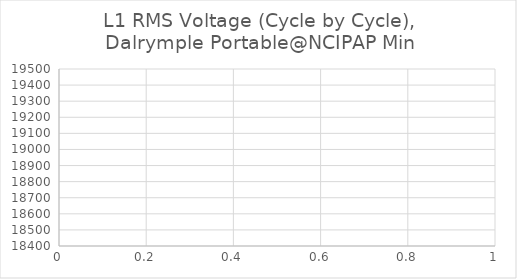
| Category | L1 RMS Voltage (Cycle by Cycle), Dalrymple Portable@NCIPAP Min |
|---|---|
| 0 | 19288.42 |
| 1 | 19290.53 |
| 2 | 19290.47 |
| 3 | 19290.45 |
| 4 | 19290.43 |
| 5 | 19285.95 |
| 6 | 19287.96 |
| 7 | 19289.97 |
| 8 | 19281.6 |
| 9 | 19283.54 |
| 10 | 19285.48 |
| 11 | 19285.42 |
| 12 | 19287.42 |
| 13 | 19289.42 |
| 14 | 19289.46 |
| 15 | 19291.43 |
| 16 | 19293.41 |
| 17 | 19293.39 |
| 18 | 19291.42 |
| 19 | 19289.45 |
| 20 | 19289.43 |
| 21 | 19289.42 |
| 22 | 19289.42 |
| 23 | 19291.41 |
| 24 | 19293.39 |
| 25 | 19293.42 |
| 26 | 19293.44 |
| 27 | 19293.45 |
| 28 | 19289.01 |
| 29 | 19289 |
| 30 | 19288.98 |
| 31 | 19288.95 |
| 32 | 19290.93 |
| 33 | 19292.91 |
| 34 | 19296.83 |
| 35 | 19294.88 |
| 36 | 19292.94 |
| 37 | 19288.95 |
| 38 | 19291.16 |
| 39 | 19293.38 |
| 40 | 19289.4 |
| 41 | 19287.43 |
| 42 | 19285.46 |
| 43 | 19289.94 |
| 44 | 19289.94 |
| 45 | 19289.94 |
| 46 | 19292.19 |
| 47 | 19294.44 |
| 48 | 19294.42 |
| 49 | 19292.43 |
| 50 | 19290.44 |
| 51 | 19290.45 |
| 52 | 19292.41 |
| 53 | 19294.38 |
| 54 | 19294.36 |
| 55 | 19292.14 |
| 56 | 19289.93 |
| 57 | 19289.98 |
| 58 | 19290 |
| 59 | 19290.02 |
| 60 | 19289.95 |
| 61 | 19291.88 |
| 62 | 19293.82 |
| 63 | 19293.85 |
| 64 | 19291.62 |
| 65 | 19289.39 |
| 66 | 19289.37 |
| 67 | 19291.38 |
| 68 | 19293.39 |
| 69 | 19285.03 |
| 70 | 19285.02 |
| 71 | 19285.01 |
| 72 | 19286.98 |
| 73 | 19288.95 |
| 74 | 19288.91 |
| 75 | 19290.88 |
| 76 | 19292.85 |
| 77 | 19292.88 |
| 78 | 19292.89 |
| 79 | 19292.89 |
| 80 | 19292.95 |
| 81 | 19290.98 |
| 82 | 19289.01 |
| 83 | 19292.91 |
| 84 | 19292.9 |
| 85 | 19292.89 |
| 86 | 19292.87 |
| 87 | 19290.67 |
| 88 | 19288.46 |
| 89 | 19288.47 |
| 90 | 19290.47 |
| 91 | 19292.47 |
| 92 | 19284.06 |
| 93 | 19288.27 |
| 94 | 19292.48 |
| 95 | 19284.08 |
| 96 | 19284.07 |
| 97 | 19284.05 |
| 98 | 19286.04 |
| 99 | 19288.03 |
| 100 | 19284.02 |
| 101 | 19284.04 |
| 102 | 19284.07 |
| 103 | 19292.46 |
| 104 | 19288.27 |
| 105 | 19284.07 |
| 106 | 19292.45 |
| 107 | 19288.25 |
| 108 | 19284.05 |
| 109 | 19284.05 |
| 110 | 19284.05 |
| 111 | 19288.01 |
| 112 | 19291.99 |
| 113 | 19289.82 |
| 114 | 19287.66 |
| 115 | 19291.7 |
| 116 | 19291.49 |
| 117 | 19291.27 |
| 118 | 19286.88 |
| 119 | 19288.87 |
| 120 | 19290.85 |
| 121 | 19290.48 |
| 122 | 19292.54 |
| 123 | 19294.6 |
| 124 | 19294.46 |
| 125 | 19294.32 |
| 126 | 19289.95 |
| 127 | 19287.76 |
| 128 | 19285.57 |
| 129 | 19289.62 |
| 130 | 19291.69 |
| 131 | 19293.75 |
| 132 | 19297.81 |
| 133 | 19293.63 |
| 134 | 19289.44 |
| 135 | 19285.19 |
| 136 | 19287.22 |
| 137 | 19289.24 |
| 138 | 19293.24 |
| 139 | 19291.07 |
| 140 | 19288.91 |
| 141 | 19284.7 |
| 142 | 19286.79 |
| 143 | 19288.88 |
| 144 | 19293 |
| 145 | 19292.97 |
| 146 | 19292.95 |
| 147 | 19288.62 |
| 148 | 19288.6 |
| 149 | 19288.59 |
| 150 | 19290.67 |
| 151 | 19292.76 |
| 152 | 19296.87 |
| 153 | 19292.7 |
| 154 | 19288.54 |
| 155 | 19292.61 |
| 156 | 19292.6 |
| 157 | 19292.6 |
| 158 | 19292.59 |
| 159 | 19290.53 |
| 160 | 19288.46 |
| 161 | 19288.52 |
| 162 | 19288.52 |
| 163 | 19288.53 |
| 164 | 19288.53 |
| 165 | 19288.51 |
| 166 | 19288.5 |
| 167 | 19288.5 |
| 168 | 19290.54 |
| 169 | 19292.58 |
| 170 | 19288.4 |
| 171 | 19290.49 |
| 172 | 19292.58 |
| 173 | 19288.43 |
| 174 | 19288.39 |
| 175 | 19288.34 |
| 176 | 19286.2 |
| 177 | 19284.06 |
| 178 | 19288.2 |
| 179 | 19286.11 |
| 180 | 19284.03 |
| 181 | 19284.04 |
| 182 | 19288.19 |
| 183 | 19292.34 |
| 184 | 19284.05 |
| 185 | 19286.11 |
| 186 | 19288.17 |
| 187 | 19283.97 |
| 188 | 19286.04 |
| 189 | 19288.11 |
| 190 | 19288.16 |
| 191 | 19288.16 |
| 192 | 19288.17 |
| 193 | 19288.19 |
| 194 | 19288.21 |
| 195 | 19288.24 |
| 196 | 19288.24 |
| 197 | 19288.18 |
| 198 | 19288.11 |
| 199 | 19288.08 |
| 200 | 19290.2 |
| 201 | 19292.32 |
| 202 | 19290.27 |
| 203 | 19288.22 |
| 204 | 19292.32 |
| 205 | 19290.24 |
| 206 | 19288.16 |
| 207 | 19288.21 |
| 208 | 19288.18 |
| 209 | 19288.15 |
| 210 | 19288.09 |
| 211 | 19288.1 |
| 212 | 19288.12 |
| 213 | 19288.21 |
| 214 | 19288.21 |
| 215 | 19288.22 |
| 216 | 19288.21 |
| 217 | 19288.21 |
| 218 | 19284.06 |
| 219 | 19288.14 |
| 220 | 19290.18 |
| 221 | 19292.23 |
| 222 | 19296.48 |
| 223 | 19292.36 |
| 224 | 19288.24 |
| 225 | 19288.22 |
| 226 | 19290.31 |
| 227 | 19292.39 |
| 228 | 19290.31 |
| 229 | 19288.23 |
| 230 | 19288.18 |
| 231 | 19288.2 |
| 232 | 19288.22 |
| 233 | 19288.28 |
| 234 | 19290.38 |
| 235 | 19292.48 |
| 236 | 19288.37 |
| 237 | 19288.37 |
| 238 | 19288.38 |
| 239 | 19292.59 |
| 240 | 19290.5 |
| 241 | 19288.41 |
| 242 | 19292.55 |
| 243 | 19292.58 |
| 244 | 19292.61 |
| 245 | 19292.56 |
| 246 | 19286.29 |
| 247 | 19280.01 |
| 248 | 19288.32 |
| 249 | 19288.37 |
| 250 | 19288.41 |
| 251 | 19288.45 |
| 252 | 19288.4 |
| 253 | 19288.36 |
| 254 | 19288.35 |
| 255 | 19288.35 |
| 256 | 19292.54 |
| 257 | 19288.39 |
| 258 | 19284.23 |
| 259 | 19288.49 |
| 260 | 19288.48 |
| 261 | 19288.47 |
| 262 | 19288.48 |
| 263 | 19288.49 |
| 264 | 19288.5 |
| 265 | 19284.29 |
| 266 | 19284.26 |
| 267 | 19284.22 |
| 268 | 19292.48 |
| 269 | 19290.43 |
| 270 | 19288.38 |
| 271 | 19284.19 |
| 272 | 19286.23 |
| 273 | 19288.27 |
| 274 | 19284.09 |
| 275 | 19288.27 |
| 276 | 19292.46 |
| 277 | 19288.33 |
| 278 | 19288.33 |
| 279 | 19288.13 |
| 280 | 19288.13 |
| 281 | 19288.12 |
| 282 | 19292.38 |
| 283 | 19288.23 |
| 284 | 19284.09 |
| 285 | 19288.28 |
| 286 | 19286.25 |
| 287 | 19284.22 |
| 288 | 19284.26 |
| 289 | 19286.33 |
| 290 | 19288.4 |
| 291 | 19292.5 |
| 292 | 19288.38 |
| 293 | 19284.25 |
| 294 | 19288.42 |
| 295 | 19288.48 |
| 296 | 19288.54 |
| 297 | 19292.76 |
| 298 | 19292.74 |
| 299 | 19292.72 |
| 300 | 19288.54 |
| 301 | 19288.56 |
| 302 | 19288.57 |
| 303 | 19288.59 |
| 304 | 19288.61 |
| 305 | 19292.82 |
| 306 | 19288.68 |
| 307 | 19284.54 |
| 308 | 19284.61 |
| 309 | 19288.83 |
| 310 | 19288.83 |
| 311 | 19292.95 |
| 312 | 19292.92 |
| 313 | 19292.9 |
| 314 | 19288.74 |
| 315 | 19288.76 |
| 316 | 19288.78 |
| 317 | 19288.78 |
| 318 | 19286.69 |
| 319 | 19284.59 |
| 320 | 19292.83 |
| 321 | 19290.71 |
| 322 | 19288.59 |
| 323 | 19288.57 |
| 324 | 19288.57 |
| 325 | 19284.37 |
| 326 | 19292.69 |
| 327 | 19292.69 |
| 328 | 19292.7 |
| 329 | 19288.54 |
| 330 | 19284.38 |
| 331 | 19288.51 |
| 332 | 19288.56 |
| 333 | 19288.62 |
| 334 | 19292.89 |
| 335 | 19290.85 |
| 336 | 19288.81 |
| 337 | 19292.97 |
| 338 | 19290.95 |
| 339 | 19288.94 |
| 340 | 19284.62 |
| 341 | 19286.77 |
| 342 | 19288.92 |
| 343 | 19288.95 |
| 344 | 19288.96 |
| 345 | 19288.97 |
| 346 | 19284.72 |
| 347 | 19284.7 |
| 348 | 19284.68 |
| 349 | 19292.98 |
| 350 | 19292.94 |
| 351 | 19292.9 |
| 352 | 19292.95 |
| 353 | 19290.87 |
| 354 | 19288.79 |
| 355 | 19288.8 |
| 356 | 19288.82 |
| 357 | 19288.8 |
| 358 | 19288.77 |
| 359 | 19288.73 |
| 360 | 19288.76 |
| 361 | 19288.73 |
| 362 | 19288.71 |
| 363 | 19292.95 |
| 364 | 19290.86 |
| 365 | 19288.77 |
| 366 | 19288.76 |
| 367 | 19290.81 |
| 368 | 19292.86 |
| 369 | 19288.58 |
| 370 | 19290.61 |
| 371 | 19292.65 |
| 372 | 19288.45 |
| 373 | 19288.38 |
| 374 | 19288.31 |
| 375 | 19288.3 |
| 376 | 19288.27 |
| 377 | 19288.24 |
| 378 | 19284.11 |
| 379 | 19286.16 |
| 380 | 19288.22 |
| 381 | 19286.12 |
| 382 | 19284.01 |
| 383 | 19288.14 |
| 384 | 19286.06 |
| 385 | 19283.97 |
| 386 | 19288.12 |
| 387 | 19288.11 |
| 388 | 19288.1 |
| 389 | 19292.29 |
| 390 | 19290.23 |
| 391 | 19288.17 |
| 392 | 19288.18 |
| 393 | 19286.11 |
| 394 | 19284.04 |
| 395 | 19288.14 |
| 396 | 19290.2 |
| 397 | 19292.26 |
| 398 | 19292.34 |
| 399 | 19292.33 |
| 400 | 19292.32 |
| 401 | 19284.05 |
| 402 | 19286.14 |
| 403 | 19288.24 |
| 404 | 19284.04 |
| 405 | 19284.01 |
| 406 | 19283.97 |
| 407 | 19283.96 |
| 408 | 19283.95 |
| 409 | 19292.28 |
| 410 | 19292.3 |
| 411 | 19292.33 |
| 412 | 19288.2 |
| 413 | 19290.29 |
| 414 | 19292.38 |
| 415 | 19288.23 |
| 416 | 19288.19 |
| 417 | 19288.14 |
| 418 | 19288.08 |
| 419 | 19290.16 |
| 420 | 19292.24 |
| 421 | 19288.15 |
| 422 | 19288.15 |
| 423 | 19288.15 |
| 424 | 19283.99 |
| 425 | 19286.09 |
| 426 | 19288.19 |
| 427 | 19292.44 |
| 428 | 19292.45 |
| 429 | 19292.46 |
| 430 | 19284.17 |
| 431 | 19286.22 |
| 432 | 19288.27 |
| 433 | 19284.1 |
| 434 | 19279.93 |
| 435 | 19284.11 |
| 436 | 19286.21 |
| 437 | 19288.32 |
| 438 | 19288.35 |
| 439 | 19290.48 |
| 440 | 19292.61 |
| 441 | 19292.63 |
| 442 | 19290.6 |
| 443 | 19288.57 |
| 444 | 19292.68 |
| 445 | 19290.61 |
| 446 | 19288.54 |
| 447 | 19292.78 |
| 448 | 19292.8 |
| 449 | 19292.82 |
| 450 | 19288.81 |
| 451 | 19288.81 |
| 452 | 19288.81 |
| 453 | 19292.95 |
| 454 | 19290.92 |
| 455 | 19288.89 |
| 456 | 19288.86 |
| 457 | 19291.02 |
| 458 | 19293.18 |
| 459 | 19289.06 |
| 460 | 19284.95 |
| 461 | 19289.23 |
| 462 | 19291.32 |
| 463 | 19293.41 |
| 464 | 19285.09 |
| 465 | 19287.18 |
| 466 | 19289.27 |
| 467 | 19293.57 |
| 468 | 19289.47 |
| 469 | 19285.38 |
| 470 | 19289.66 |
| 471 | 19289.69 |
| 472 | 19289.72 |
| 473 | 19285.61 |
| 474 | 19287.68 |
| 475 | 19289.76 |
| 476 | 19294.06 |
| 477 | 19290 |
| 478 | 19285.94 |
| 479 | 19290.19 |
| 480 | 19292.36 |
| 481 | 19294.53 |
| 482 | 19286.18 |
| 483 | 19286.15 |
| 484 | 19286.12 |
| 485 | 19286.44 |
| 486 | 19288.61 |
| 487 | 19290.78 |
| 488 | 19290.8 |
| 489 | 19290.81 |
| 490 | 19286.93 |
| 491 | 19286.91 |
| 492 | 19286.89 |
| 493 | 19291.12 |
| 494 | 19291.1 |
| 495 | 19291.08 |
| 496 | 19287.21 |
| 497 | 19289.39 |
| 498 | 19291.58 |
| 499 | 19295.93 |
| 500 | 19291.8 |
| 501 | 19287.67 |
| 502 | 19288.02 |
| 503 | 19290.15 |
| 504 | 19292.29 |
| 505 | 19288.43 |
| 506 | 19290.62 |
| 507 | 19292.81 |
| 508 | 19284.57 |
| 509 | 19286.74 |
| 510 | 19288.92 |
| 511 | 19288.97 |
| 512 | 19286.78 |
| 513 | 19284.58 |
| 514 | 19286.73 |
| 515 | 19288.89 |
| 516 | 19288.88 |
| 517 | 19288.9 |
| 518 | 19288.92 |
| 519 | 19293.27 |
| 520 | 19291.34 |
| 521 | 19289.41 |
| 522 | 19285.53 |
| 523 | 19287.74 |
| 524 | 19289.95 |
| 525 | 19286.16 |
| 526 | 19290.51 |
| 527 | 19294.85 |
| 528 | 19291.02 |
| 529 | 19289.08 |
| 530 | 19287.14 |
| 531 | 19291.5 |
| 532 | 19289.59 |
| 533 | 19287.68 |
| 534 | 19292.14 |
| 535 | 19292.19 |
| 536 | 19292.23 |
| 537 | 19292.23 |
| 538 | 19288.12 |
| 539 | 19284.01 |
| 540 | 19288.09 |
| 541 | 19292.17 |
| 542 | 19287.75 |
| 543 | 19289.64 |
| 544 | 19291.52 |
| 545 | 19295.9 |
| 546 | 19291.82 |
| 547 | 19287.74 |
| 548 | 19287.79 |
| 549 | 19285.58 |
| 550 | 19283.37 |
| 551 | 19287.7 |
| 552 | 19287.7 |
| 553 | 19287.7 |
| 554 | 19287.77 |
| 555 | 19287.79 |
| 556 | 19287.81 |
| 557 | 19292.18 |
| 558 | 19288.06 |
| 559 | 19283.94 |
| 560 | 19288.32 |
| 561 | 19288.34 |
| 562 | 19288.35 |
| 563 | 19288.39 |
| 564 | 19290.61 |
| 565 | 19292.83 |
| 566 | 19288.73 |
| 567 | 19284.64 |
| 568 | 19284.62 |
| 569 | 19286.79 |
| 570 | 19288.96 |
| 571 | 19285.19 |
| 572 | 19287.39 |
| 573 | 19289.6 |
| 574 | 19294.07 |
| 575 | 19289.99 |
| 576 | 19285.92 |
| 577 | 19290.38 |
| 578 | 19290.35 |
| 579 | 19290.32 |
| 580 | 19286.6 |
| 581 | 19286.6 |
| 582 | 19286.59 |
| 583 | 19286.58 |
| 584 | 19286.59 |
| 585 | 19286.6 |
| 586 | 19286.63 |
| 587 | 19286.62 |
| 588 | 19286.61 |
| 589 | 19286.56 |
| 590 | 19286.57 |
| 591 | 19286.57 |
| 592 | 19286.58 |
| 593 | 19286.59 |
| 594 | 19286.51 |
| 595 | 19286.5 |
| 596 | 19286.5 |
| 597 | 19290.31 |
| 598 | 19288.12 |
| 599 | 19285.92 |
| 600 | 19285.98 |
| 601 | 19287.83 |
| 602 | 19289.67 |
| 603 | 19289.58 |
| 604 | 19287.38 |
| 605 | 19285.17 |
| 606 | 19285.17 |
| 607 | 19287.06 |
| 608 | 19288.95 |
| 609 | 19284.57 |
| 610 | 19288.68 |
| 611 | 19292.8 |
| 612 | 19288.44 |
| 613 | 19286.23 |
| 614 | 19284.02 |
| 615 | 19283.9 |
| 616 | 19285.78 |
| 617 | 19287.67 |
| 618 | 19287.68 |
| 619 | 19287.7 |
| 620 | 19283.36 |
| 621 | 19287.47 |
| 622 | 19291.58 |
| 623 | 19282.84 |
| 624 | 19284.74 |
| 625 | 19286.64 |
| 626 | 19290.43 |
| 627 | 19288.2 |
| 628 | 19285.97 |
| 629 | 19286.01 |
| 630 | 19286.01 |
| 631 | 19289.9 |
| 632 | 19289.89 |
| 633 | 19287.74 |
| 634 | 19285.6 |
| 635 | 19289.99 |
| 636 | 19289.96 |
| 637 | 19289.94 |
| 638 | 19286.04 |
| 639 | 19288.2 |
| 640 | 19290.36 |
| 641 | 19290.4 |
| 642 | 19290.39 |
| 643 | 19290.38 |
| 644 | 19290.4 |
| 645 | 19290.42 |
| 646 | 19290.46 |
| 647 | 19288.32 |
| 648 | 19286.18 |
| 649 | 19290.52 |
| 650 | 19290.52 |
| 651 | 19290.52 |
| 652 | 19286.54 |
| 653 | 19288.71 |
| 654 | 19290.89 |
| 655 | 19287.16 |
| 656 | 19289.38 |
| 657 | 19291.6 |
| 658 | 19292.2 |
| 659 | 19290.29 |
| 660 | 19288.39 |
| 661 | 19288.97 |
| 662 | 19289.27 |
| 663 | 19289.57 |
| 664 | 19294.74 |
| 665 | 19295.13 |
| 666 | 19295.5 |
| 667 | 19288.08 |
| 668 | 19290.69 |
| 669 | 19293.31 |
| 670 | 18899.69 |
| 671 | 18506.07 |
| 672 | 18644.22 |
| 673 | 18727 |
| 674 | 18809.78 |
| 675 | 18815.1 |
| 676 | 18871.26 |
| 677 | 18927.42 |
| 678 | 18982.47 |
| 679 | 19000.48 |
| 680 | 19018.5 |
| 681 | 19053.81 |
| 682 | 19074.37 |
| 683 | 19094.92 |
| 684 | 19127.95 |
| 685 | 19137.16 |
| 686 | 19146.37 |
| 687 | 19174.34 |
| 688 | 19181.1 |
| 689 | 19187.85 |
| 690 | 19209.36 |
| 691 | 19209.36 |
| 692 | 19229.5 |
| 693 | 19248.8 |
| 694 | 19254.33 |
| 695 | 19259.87 |
| 696 | 19264.03 |
| 697 | 19268.19 |
| 698 | 19275.1 |
| 699 | 19277.83 |
| 700 | 19280.56 |
| 701 | 19287.06 |
| 702 | 19288.43 |
| 703 | 19289.79 |
| 704 | 19291.53 |
| 705 | 19289.21 |
| 706 | 19286.9 |
| 707 | 19292.7 |
| 708 | 19292.74 |
| 709 | 19292.78 |
| 710 | 19286.85 |
| 711 | 19283.93 |
| 712 | 19281 |
| 713 | 19283.29 |
| 714 | 19282.16 |
| 715 | 19281.04 |
| 716 | 19283.53 |
| 717 | 19280.74 |
| 718 | 19277.95 |
| 719 | 19273.4 |
| 720 | 19269.3 |
| 721 | 19265.2 |
| 722 | 19266.21 |
| 723 | 19267.27 |
| 724 | 19268.32 |
| 725 | 19267.7 |
| 726 | 19267.07 |
| 727 | 19262.54 |
| 728 | 19262.68 |
| 729 | 19262.82 |
| 730 | 19268.17 |
| 731 | 19268.68 |
| 732 | 19269.19 |
| 733 | 19268.94 |
| 734 | 19272.04 |
| 735 | 19275.14 |
| 736 | 19281.47 |
| 737 | 19281.49 |
| 738 | 19281.51 |
| 739 | 19284.69 |
| 740 | 19283.14 |
| 741 | 19281.59 |
| 742 | 19278.57 |
| 743 | 19277.84 |
| 744 | 19277.11 |
| 745 | 19280.44 |
| 746 | 19278.8 |
| 747 | 19277.15 |
| 748 | 19275.32 |
| 749 | 19280.83 |
| 750 | 19286.33 |
| 751 | 19283.92 |
| 752 | 19281.51 |
| 753 | 19284.77 |
| 754 | 19284.01 |
| 755 | 19283.26 |
| 756 | 19289.73 |
| 757 | 19288.14 |
| 758 | 19286.55 |
| 759 | 19294.44 |
| 760 | 19296.04 |
| 761 | 19297.65 |
| 762 | 19295.95 |
| 763 | 19295.13 |
| 764 | 19294.32 |
| 765 | 19297.48 |
| 766 | 19295.1 |
| 767 | 19292.72 |
| 768 | 19292.7 |
| 769 | 19288.65 |
| 770 | 19284.61 |
| 771 | 19289.42 |
| 772 | 19289.46 |
| 773 | 19289.49 |
| 774 | 19289.53 |
| 775 | 19287.13 |
| 776 | 19284.73 |
| 777 | 19286.32 |
| 778 | 19287.91 |
| 779 | 19291.01 |
| 780 | 19290.2 |
| 781 | 19289.39 |
| 782 | 19300.61 |
| 783 | 19299.87 |
| 784 | 19299.12 |
| 785 | 19297.64 |
| 786 | 19297.66 |
| 787 | 19297.67 |
| 788 | 19289.56 |
| 789 | 19290.32 |
| 790 | 19291.08 |
| 791 | 19295.85 |
| 792 | 19294.23 |
| 793 | 19292.61 |
| 794 | 19297.46 |
| 795 | 19297.5 |
| 796 | 19297.55 |
| 797 | 19300.77 |
| 798 | 19300.77 |
| 799 | 19291.12 |
| 800 | 19298.96 |
| 801 | 19296.62 |
| 802 | 19294.27 |
| 803 | 19298.34 |
| 804 | 19302.4 |
| 805 | 19297.75 |
| 806 | 19298.47 |
| 807 | 19299.19 |
| 808 | 19300.61 |
| 809 | 19299.79 |
| 810 | 19298.96 |
| 811 | 19297.48 |
| 812 | 19296.73 |
| 813 | 19295.99 |
| 814 | 19302.43 |
| 815 | 19299.34 |
| 816 | 19296.24 |
| 817 | 19297.94 |
| 818 | 19293.93 |
| 819 | 19289.92 |
| 820 | 19289.92 |
| 821 | 19293.88 |
| 822 | 19297.85 |
| 823 | 19297.87 |
| 824 | 19296.38 |
| 825 | 19294.89 |
| 826 | 19299.79 |
| 827 | 19298.21 |
| 828 | 19296.64 |
| 829 | 19300.16 |
| 830 | 19300.16 |
| 831 | 19299.03 |
| 832 | 19296.93 |
| 833 | 19294.83 |
| 834 | 19298.73 |
| 835 | 19300.73 |
| 836 | 19302.72 |
| 837 | 19301.83 |
| 838 | 19298.91 |
| 839 | 19295.99 |
| 840 | 19298.01 |
| 841 | 19296.57 |
| 842 | 19295.13 |
| 843 | 19300.1 |
| 844 | 19300.15 |
| 845 | 19300.2 |
| 846 | 19303.04 |
| 847 | 19300.5 |
| 848 | 19297.96 |
| 849 | 19300.81 |
| 850 | 19302.27 |
| 851 | 19303.72 |
| 852 | 19303.82 |
| 853 | 19303.88 |
| 854 | 19303.92 |
| 855 | 19303.93 |
| 856 | 19303.93 |
| 857 | 19308.84 |
| 858 | 19304.84 |
| 859 | 19300.83 |
| 860 | 19310.75 |
| 861 | 19310.8 |
| 862 | 19310.84 |
| 863 | 19315.96 |
| 864 | 19316 |
| 865 | 19316.04 |
| 866 | 19308.11 |
| 867 | 19304.1 |
| 868 | 19300.1 |
| 869 | 19305.03 |
| 870 | 19308.97 |
| 871 | 19312.9 |
| 872 | 19312.92 |
| 873 | 19312.96 |
| 874 | 19312.99 |
| 875 | 19313.04 |
| 876 | 19310.53 |
| 877 | 19308.02 |
| 878 | 19307.99 |
| 879 | 19310.48 |
| 880 | 19312.97 |
| 881 | 19312.92 |
| 882 | 19315.41 |
| 883 | 19317.91 |
| 884 | 19316.48 |
| 885 | 19315.05 |
| 886 | 19312.23 |
| 887 | 19314.74 |
| 888 | 19317.26 |
| 889 | 19311.59 |
| 890 | 19310.16 |
| 891 | 19308.74 |
| 892 | 19313.73 |
| 893 | 19314.84 |
| 894 | 19315.96 |
| 895 | 19313.25 |
| 896 | 19315.73 |
| 897 | 19318.21 |
| 898 | 19315.4 |
| 899 | 19315.39 |
| 900 | 19315.38 |
| 901 | 19320.44 |
| 902 | 19320.5 |
| 903 | 19320.56 |
| 904 | 19317.76 |
| 905 | 19316.38 |
| 906 | 19315 |
| 907 | 19314.52 |
| 908 | 19318.19 |
| 909 | 19321.86 |
| 910 | 19321.68 |
| 911 | 19321.5 |
| 912 | 19321.39 |
| 913 | 19321.37 |
| 914 | 19321.35 |
| 915 | 19323.83 |
| 916 | 19318.59 |
| 917 | 19313.36 |
| 918 | 19315.74 |
| 919 | 19314.41 |
| 920 | 19313.07 |
| 921 | 19318.23 |
| 922 | 19318.28 |
| 923 | 19318.34 |
| 924 | 19321.01 |
| 925 | 19322.29 |
| 926 | 19323.57 |
| 927 | 19323.56 |
| 928 | 19322.2 |
| 929 | 19320.84 |
| 930 | 19318.24 |
| 931 | 19319.55 |
| 932 | 19320.87 |
| 933 | 19328.73 |
| 934 | 19327.48 |
| 935 | 19326.23 |
| 936 | 19324.9 |
| 937 | 19323.58 |
| 938 | 19320.93 |
| 939 | 19322.2 |
| 940 | 19323.46 |
| 941 | 19323.48 |
| 942 | 19324.8 |
| 943 | 19326.13 |
| 944 | 19328.75 |
| 945 | 19327.42 |
| 946 | 19326.1 |
| 947 | 19323.41 |
| 948 | 19325.99 |
| 949 | 19328.56 |
| 950 | 19328.64 |
| 951 | 19331.24 |
| 952 | 19333.84 |
| 953 | 19331.29 |
| 954 | 19328.7 |
| 955 | 19326.12 |
| 956 | 19328.71 |
| 957 | 19327.41 |
| 958 | 19326.12 |
| 959 | 19328.82 |
| 960 | 19328.85 |
| 961 | 19328.87 |
| 962 | 19328.9 |
| 963 | 19328.93 |
| 964 | 19331.5 |
| 965 | 19330.13 |
| 966 | 19328.76 |
| 967 | 19331.21 |
| 968 | 19329.87 |
| 969 | 19328.53 |
| 970 | 19328.54 |
| 971 | 19329.89 |
| 972 | 19331.24 |
| 973 | 19328.83 |
| 974 | 19330.18 |
| 975 | 19331.52 |
| 976 | 19328.97 |
| 977 | 19327.74 |
| 978 | 19326.51 |
| 979 | 19329.08 |
| 980 | 19330.43 |
| 981 | 19331.78 |
| 982 | 19334.45 |
| 983 | 19335.78 |
| 984 | 19337.12 |
| 985 | 19332.08 |
| 986 | 19332.07 |
| 987 | 19332.06 |
| 988 | 19333.43 |
| 989 | 19334.8 |
| 990 | 19329.8 |
| 991 | 19331.15 |
| 992 | 19332.51 |
| 993 | 19340.35 |
| 994 | 19335.21 |
| 995 | 19330.07 |
| 996 | 19330.06 |
| 997 | 19332.58 |
| 998 | 19335.1 |
| 999 | 19340.23 |
| 1000 | 19338.85 |
| 1001 | 19337.48 |
| 1002 | 19339.98 |
| 1003 | 19340 |
| 1004 | 19340.02 |
| 1005 | 19342.32 |
| 1006 | 19338.4 |
| 1007 | 19334.49 |
| 1008 | 19339.55 |
| 1009 | 19338.19 |
| 1010 | 19336.82 |
| 1011 | 19342 |
| 1012 | 19342.02 |
| 1013 | 19342.03 |
| 1014 | 19340.7 |
| 1015 | 19339.36 |
| 1016 | 19336.73 |
| 1017 | 19339.25 |
| 1018 | 19341.77 |
| 1019 | 19339.14 |
| 1020 | 19337.82 |
| 1021 | 19336.49 |
| 1022 | 19339.07 |
| 1023 | 19341.61 |
| 1024 | 19344.16 |
| 1025 | 19333.77 |
| 1026 | 19338.92 |
| 1027 | 19344.07 |
| 1028 | 19346.65 |
| 1029 | 19347.96 |
| 1030 | 19349.28 |
| 1031 | 19351.9 |
| 1032 | 19350.68 |
| 1033 | 19349.46 |
| 1034 | 19344.34 |
| 1035 | 19343.05 |
| 1036 | 19341.77 |
| 1037 | 19341.88 |
| 1038 | 19343.25 |
| 1039 | 19344.63 |
| 1040 | 19346.03 |
| 1041 | 19347.43 |
| 1042 | 19350.28 |
| 1043 | 19347.9 |
| 1044 | 19347.9 |
| 1045 | 19345.41 |
| 1046 | 19345.39 |
| 1047 | 19345.38 |
| 1048 | 19345.26 |
| 1049 | 19345.28 |
| 1050 | 19345.29 |
| 1051 | 19345.29 |
| 1052 | 19347.95 |
| 1053 | 19350.61 |
| 1054 | 19350.64 |
| 1055 | 19349.42 |
| 1056 | 19348.19 |
| 1057 | 19345.72 |
| 1058 | 19348.32 |
| 1059 | 19350.92 |
| 1060 | 19348.64 |
| 1061 | 19347.46 |
| 1062 | 19346.29 |
| 1063 | 19343.9 |
| 1064 | 19345.36 |
| 1065 | 19346.82 |
| 1066 | 19345.57 |
| 1067 | 19344.32 |
| 1068 | 19341.91 |
| 1069 | 19344.55 |
| 1070 | 19347.2 |
| 1071 | 19350.29 |
| 1072 | 19349.17 |
| 1073 | 19348.05 |
| 1074 | 19348.11 |
| 1075 | 19344.25 |
| 1076 | 19340.4 |
| 1077 | 19345.6 |
| 1078 | 19344.44 |
| 1079 | 19343.27 |
| 1080 | 19348.63 |
| 1081 | 19348.65 |
| 1082 | 19348.67 |
| 1083 | 19348.77 |
| 1084 | 19348.74 |
| 1085 | 19348.71 |
| 1086 | 19343.31 |
| 1087 | 19347.11 |
| 1088 | 19350.91 |
| 1089 | 19350.88 |
| 1090 | 19348.26 |
| 1091 | 19345.65 |
| 1092 | 19345.67 |
| 1093 | 19345.69 |
| 1094 | 19353.37 |
| 1095 | 19350.68 |
| 1096 | 19347.99 |
| 1097 | 19347.94 |
| 1098 | 19347.93 |
| 1099 | 19347.91 |
| 1100 | 19355.51 |
| 1101 | 19355.52 |
| 1102 | 19355.53 |
| 1103 | 19350.28 |
| 1104 | 19351.47 |
| 1105 | 19352.66 |
| 1106 | 19357.94 |
| 1107 | 19357.94 |
| 1108 | 19357.93 |
| 1109 | 19350.28 |
| 1110 | 19354.08 |
| 1111 | 19357.88 |
| 1112 | 19357.91 |
| 1113 | 19357.91 |
| 1114 | 19357.91 |
| 1115 | 19357.95 |
| 1116 | 19355.27 |
| 1117 | 19352.59 |
| 1118 | 19355.27 |
| 1119 | 19357.95 |
| 1120 | 19357.93 |
| 1121 | 19357.91 |
| 1122 | 19357.89 |
| 1123 | 19357.91 |
| 1124 | 19360.56 |
| 1125 | 19363.21 |
| 1126 | 19357.86 |
| 1127 | 19356.71 |
| 1128 | 19355.57 |
| 1129 | 19357.92 |
| 1130 | 19357.92 |
| 1131 | 19357.92 |
| 1132 | 19352.6 |
| 1133 | 19356.43 |
| 1134 | 19360.27 |
| 1135 | 19357.3 |
| 1136 | 19358.49 |
| 1137 | 19359.67 |
| 1138 | 19354.39 |
| 1139 | 19352.92 |
| 1140 | 19351.45 |
| 1141 | 19353.83 |
| 1142 | 19357.66 |
| 1143 | 19361.5 |
| 1144 | 19362.7 |
| 1145 | 19363.91 |
| 1146 | 19358.69 |
| 1147 | 19359.9 |
| 1148 | 19361.11 |
| 1149 | 19355.87 |
| 1150 | 19359.68 |
| 1151 | 19363.48 |
| 1152 | 19363.49 |
| 1153 | 19362.29 |
| 1154 | 19361.08 |
| 1155 | 19366.36 |
| 1156 | 19365.14 |
| 1157 | 19363.93 |
| 1158 | 19363.96 |
| 1159 | 19360.1 |
| 1160 | 19356.24 |
| 1161 | 19361.49 |
| 1162 | 19361.5 |
| 1163 | 19361.51 |
| 1164 | 19359.16 |
| 1165 | 19361.8 |
| 1166 | 19364.45 |
| 1167 | 19364.45 |
| 1168 | 19365.9 |
| 1169 | 19367.36 |
| 1170 | 19364.94 |
| 1171 | 19363.77 |
| 1172 | 19362.6 |
| 1173 | 19361.41 |
| 1174 | 19360.22 |
| 1175 | 19368.54 |
| 1176 | 19367.37 |
| 1177 | 19366.2 |
| 1178 | 19363.94 |
| 1179 | 19362.79 |
| 1180 | 19361.63 |
| 1181 | 19364.61 |
| 1182 | 19364.62 |
| 1183 | 19364.63 |
| 1184 | 19367.71 |
| 1185 | 19366.6 |
| 1186 | 19365.49 |
| 1187 | 19370.84 |
| 1188 | 19365.88 |
| 1189 | 19360.92 |
| 1190 | 19364.02 |
| 1191 | 19365.59 |
| 1192 | 19367.16 |
| 1193 | 19368.19 |
| 1194 | 19366.01 |
| 1195 | 19363.82 |
| 1196 | 19364.94 |
| 1197 | 19363.84 |
| 1198 | 19362.74 |
| 1199 | 19364.35 |
| 1200 | 19365.96 |
| 1201 | 19363.88 |
| 1202 | 19366.61 |
| 1203 | 19369.34 |
| 1204 | 19367.26 |
| 1205 | 19368.93 |
| 1206 | 19370.6 |
| 1207 | 19360.94 |
| 1208 | 19362.6 |
| 1209 | 19364.27 |
| 1210 | 19367.66 |
| 1211 | 19365.62 |
| 1212 | 19363.59 |
| 1213 | 19367.07 |
| 1214 | 19369.82 |
| 1215 | 19372.57 |
| 1216 | 19370.55 |
| 1217 | 19369.56 |
| 1218 | 19368.56 |
| 1219 | 19366.53 |
| 1220 | 19369.28 |
| 1221 | 19372.03 |
| 1222 | 19375.55 |
| 1223 | 19374.59 |
| 1224 | 19373.63 |
| 1225 | 19372.67 |
| 1226 | 19371.71 |
| 1227 | 19377.24 |
| 1228 | 19373.48 |
| 1229 | 19369.72 |
| 1230 | 19377.12 |
| 1231 | 19374.36 |
| 1232 | 19371.6 |
| 1233 | 19371.62 |
| 1234 | 19371.63 |
| 1235 | 19371.65 |
| 1236 | 19379.13 |
| 1237 | 19376.37 |
| 1238 | 19373.62 |
| 1239 | 19373.66 |
| 1240 | 19374.63 |
| 1241 | 19375.59 |
| 1242 | 19375.59 |
| 1243 | 19372.83 |
| 1244 | 19370.07 |
| 1245 | 19372.04 |
| 1246 | 19373.01 |
| 1247 | 19373.99 |
| 1248 | 19374.01 |
| 1249 | 19375.05 |
| 1250 | 19376.09 |
| 1251 | 19376.07 |
| 1252 | 19376.05 |
| 1253 | 19378.1 |
| 1254 | 19378.09 |
| 1255 | 19378.08 |
| 1256 | 19372.5 |
| 1257 | 19372.52 |
| 1258 | 19372.53 |
| 1259 | 19372.6 |
| 1260 | 19375.35 |
| 1261 | 19378.1 |
| 1262 | 19378.07 |
| 1263 | 19378.04 |
| 1264 | 19378.02 |
| 1265 | 19377.99 |
| 1266 | 19378.01 |
| 1267 | 19378.02 |
| 1268 | 19378.05 |
| 1269 | 19378.05 |
| 1270 | 19378.05 |
| 1271 | 19380.04 |
| 1272 | 19380.04 |
| 1273 | 19380.04 |
| 1274 | 19380.08 |
| 1275 | 19377.34 |
| 1276 | 19374.6 |
| 1277 | 19374.62 |
| 1278 | 19374.64 |
| 1279 | 19369.11 |
| 1280 | 19369.08 |
| 1281 | 19369.05 |
| 1282 | 19376.52 |
| 1283 | 19377.55 |
| 1284 | 19378.59 |
| 1285 | 19373.21 |
| 1286 | 19374.26 |
| 1287 | 19375.31 |
| 1288 | 19371.92 |
| 1289 | 19375.64 |
| 1290 | 19379.35 |
| 1291 | 19373.87 |
| 1292 | 19374.9 |
| 1293 | 19375.93 |
| 1294 | 19370.49 |
| 1295 | 19374.28 |
| 1296 | 19378.06 |
| 1297 | 19372.66 |
| 1298 | 19373.72 |
| 1299 | 19374.79 |
| 1300 | 19376.92 |
| 1301 | 19376.92 |
| 1302 | 19376.92 |
| 1303 | 19374.18 |
| 1304 | 19371.45 |
| 1305 | 19378.96 |
| 1306 | 19378.95 |
| 1307 | 19378.95 |
| 1308 | 19379.04 |
| 1309 | 19380.11 |
| 1310 | 19381.18 |
| 1311 | 19381.15 |
| 1312 | 19377.35 |
| 1313 | 19373.55 |
| 1314 | 19373.52 |
| 1315 | 19377.29 |
| 1316 | 19381.07 |
| 1317 | 19381.14 |
| 1318 | 19381.14 |
| 1319 | 19381.22 |
| 1320 | 19379.05 |
| 1321 | 19377.96 |
| 1322 | 19376.88 |
| 1323 | 19382.32 |
| 1324 | 19381.26 |
| 1325 | 19380.2 |
| 1326 | 19378.07 |
| 1327 | 19379.75 |
| 1328 | 19381.42 |
| 1329 | 19383.13 |
| 1330 | 19384.83 |
| 1331 | 19377.34 |
| 1332 | 19376.31 |
| 1333 | 19375.29 |
| 1334 | 19373.16 |
| 1335 | 19378.63 |
| 1336 | 19384.1 |
| 1337 | 19382.06 |
| 1338 | 19383.79 |
| 1339 | 19385.53 |
| 1340 | 19383.55 |
| 1341 | 19384.32 |
| 1342 | 19385.09 |
| 1343 | 19375.62 |
| 1344 | 19377.37 |
| 1345 | 19379.13 |
| 1346 | 19382.71 |
| 1347 | 19381.72 |
| 1348 | 19380.73 |
| 1349 | 19382.43 |
| 1350 | 19384.27 |
| 1351 | 19386.11 |
| 1352 | 19384.24 |
| 1353 | 19386.08 |
| 1354 | 19387.93 |
| 1355 | 19386.06 |
| 1356 | 19384.19 |
| 1357 | 19374.86 |
| 1358 | 19379.52 |
| 1359 | 19384.18 |
| 1360 | 19380.5 |
| 1361 | 19381.56 |
| 1362 | 19382.62 |
| 1363 | 19384.73 |
| 1364 | 19381.23 |
| 1365 | 19381.23 |
| 1366 | 19383.29 |
| 1367 | 19382.42 |
| 1368 | 19381.54 |
| 1369 | 19379.78 |
| 1370 | 19381.77 |
| 1371 | 19383.75 |
| 1372 | 19382.1 |
| 1373 | 19381.32 |
| 1374 | 19380.54 |
| 1375 | 19386.24 |
| 1376 | 19382.52 |
| 1377 | 19378.8 |
| 1378 | 19377.11 |
| 1379 | 19379.94 |
| 1380 | 19382.77 |
| 1381 | 19379.09 |
| 1382 | 19375.42 |
| 1383 | 19375.38 |
| 1384 | 19379.1 |
| 1385 | 19382.82 |
| 1386 | 19382.82 |
| 1387 | 19382.83 |
| 1388 | 19382.83 |
| 1389 | 19382.83 |
| 1390 | 19382.82 |
| 1391 | 19382.8 |
| 1392 | 19382.85 |
| 1393 | 19379.97 |
| 1394 | 19377.1 |
| 1395 | 19384.43 |
| 1396 | 19384.43 |
| 1397 | 19384.43 |
| 1398 | 19384.5 |
| 1399 | 19381.64 |
| 1400 | 19378.79 |
| 1401 | 19380.4 |
| 1402 | 19384.09 |
| 1403 | 19387.77 |
| 1404 | 19382.1 |
| 1405 | 19382.12 |
| 1406 | 19382.13 |
| 1407 | 19382.16 |
| 1408 | 19382.2 |
| 1409 | 19382.2 |
| 1410 | 19382.18 |
| 1411 | 19382.16 |
| 1412 | 19373.06 |
| 1413 | 19377.9 |
| 1414 | 19382.75 |
| 1415 | 19379.44 |
| 1416 | 19380.71 |
| 1417 | 19381.97 |
| 1418 | 19386.13 |
| 1419 | 19388.21 |
| 1420 | 19390.29 |
| 1421 | 19387.08 |
| 1422 | 19382.61 |
| 1423 | 19378.14 |
| 1424 | 19374.95 |
| 1425 | 19377.12 |
| 1426 | 19379.29 |
| 1427 | 19383.66 |
| 1428 | 19387.29 |
| 1429 | 19390.93 |
| 1430 | 19383.63 |
| 1431 | 19383.57 |
| 1432 | 19383.52 |
| 1433 | 19382.75 |
| 1434 | 19381.99 |
| 1435 | 19380.44 |
| 1436 | 19383.39 |
| 1437 | 19386.33 |
| 1438 | 19385 |
| 1439 | 19384.25 |
| 1440 | 19383.49 |
| 1441 | 19381.98 |
| 1442 | 19381.21 |
| 1443 | 19380.44 |
| 1444 | 19378.89 |
| 1445 | 19381.11 |
| 1446 | 19383.33 |
| 1447 | 19381.93 |
| 1448 | 19384.88 |
| 1449 | 19387.83 |
| 1450 | 19386.47 |
| 1451 | 19385.76 |
| 1452 | 19385.05 |
| 1453 | 19377.71 |
| 1454 | 19391.89 |
| 1455 | 19406.06 |
| 1456 | 19402.93 |
| 1457 | 19387.18 |
| 1458 | 19371.42 |
| 1459 | 19375.5 |
| 1460 | 19379.58 |
| 1461 | 19383.63 |
| 1462 | 19380.8 |
| 1463 | 19377.97 |
| 1464 | 19381.36 |
| 1465 | 19380.82 |
| 1466 | 19380.28 |
| 1467 | 19379.9 |
| 1468 | 19379.94 |
| 1469 | 19379.98 |
| 1470 | 19387.07 |
| 1471 | 19388.35 |
| 1472 | 19388.35 |
| 1473 | 19392.62 |
| 1474 | 19391.92 |
| 1475 | 19391.23 |
| 1476 | 19388.13 |
| 1477 | 19385.23 |
| 1478 | 19382.32 |
| 1479 | 19377.73 |
| 1480 | 19379.45 |
| 1481 | 19381.17 |
| 1482 | 19384.8 |
| 1483 | 19382.55 |
| 1484 | 19380.3 |
| 1485 | 19382.63 |
| 1486 | 19384.96 |
| 1487 | 19389.7 |
| 1488 | 19387.36 |
| 1489 | 19385.02 |
| 1490 | 19382.24 |
| 1491 | 19382.95 |
| 1492 | 19383.66 |
| 1493 | 19382.07 |
| 1494 | 19382.43 |
| 1495 | 19382.79 |
| 1496 | 19383.25 |
| 1497 | 19380.59 |
| 1498 | 19377.94 |
| 1499 | 19374.62 |
| 1500 | 19373.94 |
| 1501 | 19373.26 |
| 1502 | 19373.86 |
| 1503 | 19380.42 |
| 1504 | 19386.98 |
| 1505 | 19386.96 |
| 1506 | 19382.94 |
| 1507 | 19378.92 |
| 1508 | 19381.28 |
| 1509 | 19383.65 |
| 1510 | 19388.45 |
| 1511 | 19384.45 |
| 1512 | 19380.45 |
| 1513 | 19380.45 |
| 1514 | 19376.46 |
| 1515 | 19372.46 |
| 1516 | 19380.42 |
| 1517 | 19378.04 |
| 1518 | 19375.65 |
| 1519 | 19377.24 |
| 1520 | 19379.56 |
| 1521 | 19381.89 |
| 1522 | 19385.09 |
| 1523 | 19380.36 |
| 1524 | 19375.63 |
| 1525 | 19379.03 |
| 1526 | 19380.74 |
| 1527 | 19382.45 |
| 1528 | 19386.01 |
| 1529 | 19386.33 |
| 1530 | 19386.65 |
| 1531 | 19384.5 |
| 1532 | 19385.99 |
| 1533 | 19387.48 |
| 1534 | 19385.17 |
| 1535 | 19382.86 |
| 1536 | 19378.57 |
| 1537 | 19376.59 |
| 1538 | 19374.61 |
| 1539 | 19375.99 |
| 1540 | 19379.59 |
| 1541 | 19383.19 |
| 1542 | 19377.74 |
| 1543 | 19380.24 |
| 1544 | 19382.75 |
| 1545 | 19385.29 |
| 1546 | 19382.69 |
| 1547 | 19380.09 |
| 1548 | 19385.26 |
| 1549 | 19385.26 |
| 1550 | 19385.26 |
| 1551 | 19377.53 |
| 1552 | 19380.11 |
| 1553 | 19382.68 |
| 1554 | 19377.54 |
| 1555 | 19380.12 |
| 1556 | 19382.69 |
| 1557 | 19380.14 |
| 1558 | 19382.71 |
| 1559 | 19385.28 |
| 1560 | 19383.99 |
| 1561 | 19382.71 |
| 1562 | 19380.14 |
| 1563 | 19377.58 |
| 1564 | 19375.01 |
| 1565 | 19377.5 |
| 1566 | 19376.2 |
| 1567 | 19374.91 |
| 1568 | 19380.16 |